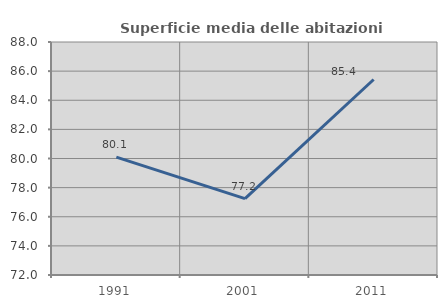
| Category | Superficie media delle abitazioni occupate |
|---|---|
| 1991.0 | 80.093 |
| 2001.0 | 77.246 |
| 2011.0 | 85.426 |